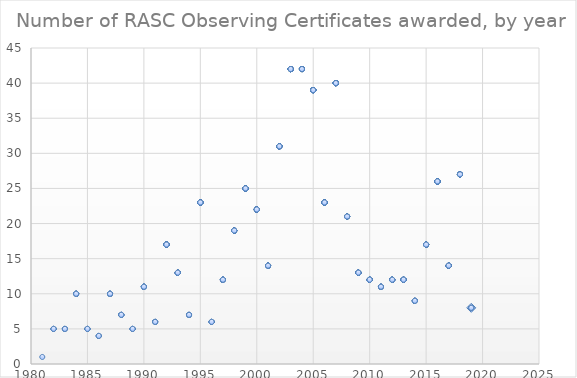
| Category | Series 0 |
|---|---|
| 2019.0 | 8 |
| 2019.0 | 8 |
| 2019.0 | 8 |
| 2019.0 | 8 |
| 2019.0 | 8 |
| 2019.0 | 8 |
| 2018.0 | 27 |
| 2018.0 | 27 |
| 2018.0 | 27 |
| 2018.0 | 27 |
| 2018.0 | 27 |
| 2018.0 | 27 |
| 2018.0 | 27 |
| 2018.0 | 27 |
| 2018.0 | 27 |
| 2018.0 | 27 |
| 2018.0 | 27 |
| 2018.0 | 27 |
| 2018.0 | 27 |
| 2018.0 | 27 |
| 2018.0 | 27 |
| 2018.0 | 27 |
| 2018.0 | 27 |
| 2018.0 | 27 |
| 2018.0 | 27 |
| 2018.0 | 27 |
| 2018.0 | 27 |
| 2018.0 | 27 |
| 2018.0 | 27 |
| 2018.0 | 27 |
| 2018.0 | 27 |
| 2018.0 | 27 |
| 2018.0 | 27 |
| 2017.0 | 14 |
| 2017.0 | 14 |
| 2017.0 | 14 |
| 2017.0 | 14 |
| 2017.0 | 14 |
| 2017.0 | 14 |
| 2017.0 | 14 |
| 2017.0 | 14 |
| 2017.0 | 14 |
| 2017.0 | 14 |
| 2017.0 | 14 |
| 2017.0 | 14 |
| 2017.0 | 14 |
| 2017.0 | 14 |
| 2016.0 | 26 |
| 2016.0 | 26 |
| 2016.0 | 26 |
| 2016.0 | 26 |
| 2016.0 | 26 |
| 2016.0 | 26 |
| 2016.0 | 26 |
| 2016.0 | 26 |
| 2016.0 | 26 |
| 2016.0 | 26 |
| 2016.0 | 26 |
| 2016.0 | 26 |
| 2016.0 | 26 |
| 2016.0 | 26 |
| 2016.0 | 26 |
| 2016.0 | 26 |
| 2016.0 | 26 |
| 2016.0 | 26 |
| 2016.0 | 26 |
| 2016.0 | 26 |
| 2016.0 | 26 |
| 2016.0 | 26 |
| 2016.0 | 26 |
| 2016.0 | 26 |
| 2016.0 | 26 |
| 2016.0 | 26 |
| 2015.0 | 17 |
| 2015.0 | 17 |
| 2015.0 | 17 |
| 2015.0 | 17 |
| 2015.0 | 17 |
| 2015.0 | 17 |
| 2015.0 | 17 |
| 2015.0 | 17 |
| 2015.0 | 17 |
| 2015.0 | 17 |
| 2015.0 | 17 |
| 2015.0 | 17 |
| 2015.0 | 17 |
| 2015.0 | 17 |
| 2015.0 | 17 |
| 2015.0 | 17 |
| 2015.0 | 17 |
| 2014.0 | 9 |
| 2014.0 | 9 |
| 2014.0 | 9 |
| 2014.0 | 9 |
| 2014.0 | 9 |
| 2014.0 | 9 |
| 2014.0 | 9 |
| 2014.0 | 9 |
| 2014.0 | 9 |
| 2013.0 | 12 |
| 2013.0 | 12 |
| 2013.0 | 12 |
| 2013.0 | 12 |
| 2013.0 | 12 |
| 2013.0 | 12 |
| 2013.0 | 12 |
| 2013.0 | 12 |
| 2013.0 | 12 |
| 2013.0 | 12 |
| 2013.0 | 12 |
| 2013.0 | 12 |
| 2012.0 | 12 |
| 2012.0 | 12 |
| 2012.0 | 12 |
| 2012.0 | 12 |
| 2012.0 | 12 |
| 2012.0 | 12 |
| 2012.0 | 12 |
| 2012.0 | 12 |
| 2012.0 | 12 |
| 2012.0 | 12 |
| 2012.0 | 12 |
| 2012.0 | 12 |
| 2011.0 | 11 |
| 2011.0 | 11 |
| 2011.0 | 11 |
| 2011.0 | 11 |
| 2011.0 | 11 |
| 2011.0 | 11 |
| 2011.0 | 11 |
| 2011.0 | 11 |
| 2011.0 | 11 |
| 2011.0 | 11 |
| 2011.0 | 11 |
| 2010.0 | 12 |
| 2010.0 | 12 |
| 2010.0 | 12 |
| 2010.0 | 12 |
| 2010.0 | 12 |
| 2010.0 | 12 |
| 2010.0 | 12 |
| 2010.0 | 12 |
| 2010.0 | 12 |
| 2010.0 | 12 |
| 2010.0 | 12 |
| 2010.0 | 12 |
| 2009.0 | 13 |
| 2009.0 | 13 |
| 2009.0 | 13 |
| 2009.0 | 13 |
| 2009.0 | 13 |
| 2009.0 | 13 |
| 2009.0 | 13 |
| 2009.0 | 13 |
| 2009.0 | 13 |
| 2009.0 | 13 |
| 2009.0 | 13 |
| 2009.0 | 13 |
| 2009.0 | 13 |
| 2008.0 | 21 |
| 2008.0 | 21 |
| 2008.0 | 21 |
| 2008.0 | 21 |
| 2008.0 | 21 |
| 2008.0 | 21 |
| 2008.0 | 21 |
| 2008.0 | 21 |
| 2008.0 | 21 |
| 2008.0 | 21 |
| 2008.0 | 21 |
| 2008.0 | 21 |
| 2008.0 | 21 |
| 2008.0 | 21 |
| 2008.0 | 21 |
| 2008.0 | 21 |
| 2008.0 | 21 |
| 2008.0 | 21 |
| 2008.0 | 21 |
| 2008.0 | 21 |
| 2008.0 | 21 |
| 2007.0 | 40 |
| 2007.0 | 40 |
| 2007.0 | 40 |
| 2007.0 | 40 |
| 2007.0 | 40 |
| 2007.0 | 40 |
| 2007.0 | 40 |
| 2007.0 | 40 |
| 2007.0 | 40 |
| 2007.0 | 40 |
| 2007.0 | 40 |
| 2007.0 | 40 |
| 2007.0 | 40 |
| 2007.0 | 40 |
| 2007.0 | 40 |
| 2007.0 | 40 |
| 2007.0 | 40 |
| 2007.0 | 40 |
| 2007.0 | 40 |
| 2007.0 | 40 |
| 2007.0 | 40 |
| 2007.0 | 40 |
| 2007.0 | 40 |
| 2007.0 | 40 |
| 2007.0 | 40 |
| 2007.0 | 40 |
| 2007.0 | 40 |
| 2007.0 | 40 |
| 2007.0 | 40 |
| 2007.0 | 40 |
| 2007.0 | 40 |
| 2007.0 | 40 |
| 2007.0 | 40 |
| 2007.0 | 40 |
| 2007.0 | 40 |
| 2007.0 | 40 |
| 2007.0 | 40 |
| 2007.0 | 40 |
| 2007.0 | 40 |
| 2007.0 | 40 |
| 2006.0 | 23 |
| 2006.0 | 23 |
| 2006.0 | 23 |
| 2006.0 | 23 |
| 2006.0 | 23 |
| 2006.0 | 23 |
| 2006.0 | 23 |
| 2006.0 | 23 |
| 2006.0 | 23 |
| 2006.0 | 23 |
| 2006.0 | 23 |
| 2006.0 | 23 |
| 2006.0 | 23 |
| 2006.0 | 23 |
| 2006.0 | 23 |
| 2006.0 | 23 |
| 2006.0 | 23 |
| 2006.0 | 23 |
| 2006.0 | 23 |
| 2006.0 | 23 |
| 2006.0 | 23 |
| 2006.0 | 23 |
| 2006.0 | 23 |
| 2005.0 | 39 |
| 2005.0 | 39 |
| 2005.0 | 39 |
| 2005.0 | 39 |
| 2005.0 | 39 |
| 2005.0 | 39 |
| 2005.0 | 39 |
| 2005.0 | 39 |
| 2005.0 | 39 |
| 2005.0 | 39 |
| 2005.0 | 39 |
| 2005.0 | 39 |
| 2005.0 | 39 |
| 2005.0 | 39 |
| 2005.0 | 39 |
| 2005.0 | 39 |
| 2005.0 | 39 |
| 2005.0 | 39 |
| 2005.0 | 39 |
| 2005.0 | 39 |
| 2005.0 | 39 |
| 2005.0 | 39 |
| 2005.0 | 39 |
| 2005.0 | 39 |
| 2005.0 | 39 |
| 2005.0 | 39 |
| 2005.0 | 39 |
| 2005.0 | 39 |
| 2005.0 | 39 |
| 2005.0 | 39 |
| 2005.0 | 39 |
| 2005.0 | 39 |
| 2005.0 | 39 |
| 2005.0 | 39 |
| 2005.0 | 39 |
| 2005.0 | 39 |
| 2005.0 | 39 |
| 2005.0 | 39 |
| 2005.0 | 39 |
| 2004.0 | 42 |
| 2004.0 | 42 |
| 2004.0 | 42 |
| 2004.0 | 42 |
| 2004.0 | 42 |
| 2004.0 | 42 |
| 2004.0 | 42 |
| 2004.0 | 42 |
| 2004.0 | 42 |
| 2004.0 | 42 |
| 2004.0 | 42 |
| 2004.0 | 42 |
| 2004.0 | 42 |
| 2004.0 | 42 |
| 2004.0 | 42 |
| 2004.0 | 42 |
| 2004.0 | 42 |
| 2004.0 | 42 |
| 2004.0 | 42 |
| 2004.0 | 42 |
| 2004.0 | 42 |
| 2004.0 | 42 |
| 2004.0 | 42 |
| 2004.0 | 42 |
| 2004.0 | 42 |
| 2004.0 | 42 |
| 2004.0 | 42 |
| 2004.0 | 42 |
| 2004.0 | 42 |
| 2004.0 | 42 |
| 2004.0 | 42 |
| 2004.0 | 42 |
| 2004.0 | 42 |
| 2004.0 | 42 |
| 2004.0 | 42 |
| 2004.0 | 42 |
| 2004.0 | 42 |
| 2004.0 | 42 |
| 2004.0 | 42 |
| 2004.0 | 42 |
| 2004.0 | 42 |
| 2004.0 | 42 |
| 2003.0 | 42 |
| 2003.0 | 42 |
| 2003.0 | 42 |
| 2003.0 | 42 |
| 2003.0 | 42 |
| 2003.0 | 42 |
| 2003.0 | 42 |
| 2003.0 | 42 |
| 2003.0 | 42 |
| 2003.0 | 42 |
| 2003.0 | 42 |
| 2003.0 | 42 |
| 2003.0 | 42 |
| 2003.0 | 42 |
| 2003.0 | 42 |
| 2003.0 | 42 |
| 2003.0 | 42 |
| 2003.0 | 42 |
| 2003.0 | 42 |
| 2003.0 | 42 |
| 2003.0 | 42 |
| 2003.0 | 42 |
| 2003.0 | 42 |
| 2003.0 | 42 |
| 2003.0 | 42 |
| 2003.0 | 42 |
| 2003.0 | 42 |
| 2003.0 | 42 |
| 2003.0 | 42 |
| 2003.0 | 42 |
| 2003.0 | 42 |
| 2003.0 | 42 |
| 2003.0 | 42 |
| 2003.0 | 42 |
| 2003.0 | 42 |
| 2003.0 | 42 |
| 2003.0 | 42 |
| 2003.0 | 42 |
| 2003.0 | 42 |
| 2003.0 | 42 |
| 2003.0 | 42 |
| 2003.0 | 42 |
| 2002.0 | 31 |
| 2002.0 | 31 |
| 2002.0 | 31 |
| 2002.0 | 31 |
| 2002.0 | 31 |
| 2002.0 | 31 |
| 2002.0 | 31 |
| 2002.0 | 31 |
| 2002.0 | 31 |
| 2002.0 | 31 |
| 2002.0 | 31 |
| 2002.0 | 31 |
| 2002.0 | 31 |
| 2002.0 | 31 |
| 2002.0 | 31 |
| 2002.0 | 31 |
| 2002.0 | 31 |
| 2002.0 | 31 |
| 2002.0 | 31 |
| 2002.0 | 31 |
| 2002.0 | 31 |
| 2002.0 | 31 |
| 2002.0 | 31 |
| 2002.0 | 31 |
| 2002.0 | 31 |
| 2002.0 | 31 |
| 2002.0 | 31 |
| 2002.0 | 31 |
| 2002.0 | 31 |
| 2002.0 | 31 |
| 2002.0 | 31 |
| 2001.0 | 14 |
| 2001.0 | 14 |
| 2001.0 | 14 |
| 2001.0 | 14 |
| 2001.0 | 14 |
| 2001.0 | 14 |
| 2001.0 | 14 |
| 2001.0 | 14 |
| 2001.0 | 14 |
| 2001.0 | 14 |
| 2001.0 | 14 |
| 2001.0 | 14 |
| 2001.0 | 14 |
| 2001.0 | 14 |
| 2000.0 | 22 |
| 2000.0 | 22 |
| 2000.0 | 22 |
| 2000.0 | 22 |
| 2000.0 | 22 |
| 2000.0 | 22 |
| 2000.0 | 22 |
| 2000.0 | 22 |
| 2000.0 | 22 |
| 2000.0 | 22 |
| 2000.0 | 22 |
| 2000.0 | 22 |
| 2000.0 | 22 |
| 2000.0 | 22 |
| 2000.0 | 22 |
| 2000.0 | 22 |
| 2000.0 | 22 |
| 2000.0 | 22 |
| 2000.0 | 22 |
| 2000.0 | 22 |
| 2000.0 | 22 |
| 2000.0 | 22 |
| 1999.0 | 25 |
| 1999.0 | 25 |
| 1999.0 | 25 |
| 1999.0 | 25 |
| 1999.0 | 25 |
| 1999.0 | 25 |
| 1999.0 | 25 |
| 1999.0 | 25 |
| 1999.0 | 25 |
| 1999.0 | 25 |
| 1999.0 | 25 |
| 1999.0 | 25 |
| 1999.0 | 25 |
| 1999.0 | 25 |
| 1999.0 | 25 |
| 1999.0 | 25 |
| 1999.0 | 25 |
| 1999.0 | 25 |
| 1999.0 | 25 |
| 1999.0 | 25 |
| 1999.0 | 25 |
| 1999.0 | 25 |
| 1999.0 | 25 |
| 1999.0 | 25 |
| 1999.0 | 25 |
| 1998.0 | 19 |
| 1998.0 | 19 |
| 1998.0 | 19 |
| 1998.0 | 19 |
| 1998.0 | 19 |
| 1998.0 | 19 |
| 1998.0 | 19 |
| 1998.0 | 19 |
| 1998.0 | 19 |
| 1998.0 | 19 |
| 1998.0 | 19 |
| 1998.0 | 19 |
| 1998.0 | 19 |
| 1998.0 | 19 |
| 1998.0 | 19 |
| 1998.0 | 19 |
| 1998.0 | 19 |
| 1998.0 | 19 |
| 1998.0 | 19 |
| 1997.0 | 12 |
| 1997.0 | 12 |
| 1997.0 | 12 |
| 1997.0 | 12 |
| 1997.0 | 12 |
| 1997.0 | 12 |
| 1997.0 | 12 |
| 1997.0 | 12 |
| 1997.0 | 12 |
| 1997.0 | 12 |
| 1997.0 | 12 |
| 1997.0 | 12 |
| 1996.0 | 6 |
| 1996.0 | 6 |
| 1996.0 | 6 |
| 1996.0 | 6 |
| 1996.0 | 6 |
| 1996.0 | 6 |
| 1995.0 | 23 |
| 1995.0 | 23 |
| 1995.0 | 23 |
| 1995.0 | 23 |
| 1995.0 | 23 |
| 1995.0 | 23 |
| 1995.0 | 23 |
| 1995.0 | 23 |
| 1995.0 | 23 |
| 1995.0 | 23 |
| 1995.0 | 23 |
| 1995.0 | 23 |
| 1995.0 | 23 |
| 1995.0 | 23 |
| 1995.0 | 23 |
| 1995.0 | 23 |
| 1995.0 | 23 |
| 1995.0 | 23 |
| 1995.0 | 23 |
| 1995.0 | 23 |
| 1995.0 | 23 |
| 1995.0 | 23 |
| 1995.0 | 23 |
| 1994.0 | 7 |
| 1994.0 | 7 |
| 1994.0 | 7 |
| 1994.0 | 7 |
| 1994.0 | 7 |
| 1994.0 | 7 |
| 1994.0 | 7 |
| 1993.0 | 13 |
| 1993.0 | 13 |
| 1993.0 | 13 |
| 1993.0 | 13 |
| 1993.0 | 13 |
| 1993.0 | 13 |
| 1993.0 | 13 |
| 1993.0 | 13 |
| 1993.0 | 13 |
| 1993.0 | 13 |
| 1993.0 | 13 |
| 1993.0 | 13 |
| 1993.0 | 13 |
| 1992.0 | 17 |
| 1992.0 | 17 |
| 1992.0 | 17 |
| 1992.0 | 17 |
| 1992.0 | 17 |
| 1992.0 | 17 |
| 1992.0 | 17 |
| 1992.0 | 17 |
| 1992.0 | 17 |
| 1992.0 | 17 |
| 1992.0 | 17 |
| 1992.0 | 17 |
| 1992.0 | 17 |
| 1992.0 | 17 |
| 1992.0 | 17 |
| 1992.0 | 17 |
| 1992.0 | 17 |
| 1991.0 | 6 |
| 1991.0 | 6 |
| 1991.0 | 6 |
| 1991.0 | 6 |
| 1991.0 | 6 |
| 1991.0 | 6 |
| 1990.0 | 11 |
| 1990.0 | 11 |
| 1990.0 | 11 |
| 1990.0 | 11 |
| 1990.0 | 11 |
| 1990.0 | 11 |
| 1990.0 | 11 |
| 1990.0 | 11 |
| 1990.0 | 11 |
| 1990.0 | 11 |
| 1990.0 | 11 |
| 1989.0 | 5 |
| 1989.0 | 5 |
| 1989.0 | 5 |
| 1989.0 | 5 |
| 1989.0 | 5 |
| 1988.0 | 7 |
| 1988.0 | 7 |
| 1988.0 | 7 |
| 1988.0 | 7 |
| 1988.0 | 7 |
| 1988.0 | 7 |
| 1988.0 | 7 |
| 1987.0 | 10 |
| 1987.0 | 10 |
| 1987.0 | 10 |
| 1987.0 | 10 |
| 1987.0 | 10 |
| 1987.0 | 10 |
| 1987.0 | 10 |
| 1987.0 | 10 |
| 1987.0 | 10 |
| 1987.0 | 10 |
| 1986.0 | 4 |
| 1986.0 | 4 |
| 1986.0 | 4 |
| 1986.0 | 4 |
| 1985.0 | 5 |
| 1985.0 | 5 |
| 1985.0 | 5 |
| 1985.0 | 5 |
| 1985.0 | 5 |
| 1984.0 | 10 |
| 1984.0 | 10 |
| 1984.0 | 10 |
| 1984.0 | 10 |
| 1984.0 | 10 |
| 1984.0 | 10 |
| 1984.0 | 10 |
| 1984.0 | 10 |
| 1984.0 | 10 |
| 1984.0 | 10 |
| 1983.0 | 5 |
| 1983.0 | 5 |
| 1983.0 | 5 |
| 1983.0 | 5 |
| 1983.0 | 5 |
| 1982.0 | 5 |
| 1982.0 | 5 |
| 1982.0 | 5 |
| 1982.0 | 5 |
| 1982.0 | 5 |
| 1981.0 | 1 |